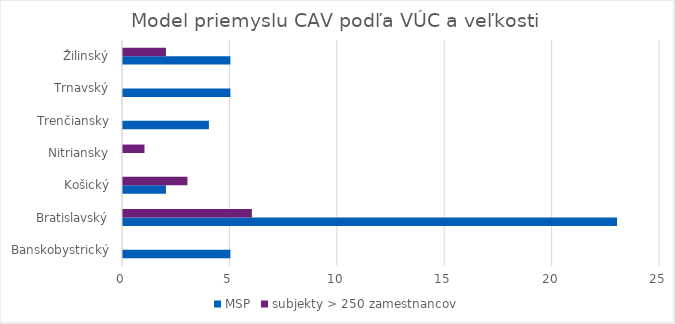
| Category | MSP | subjekty > 250 zamestnancov |
|---|---|---|
| Banskobystrický | 5 | 0 |
| Bratislavský | 23 | 6 |
| Košický | 2 | 3 |
| Nitriansky | 0 | 1 |
| Trenčiansky | 4 | 0 |
| Trnavský | 5 | 0 |
| Žilinský | 5 | 2 |